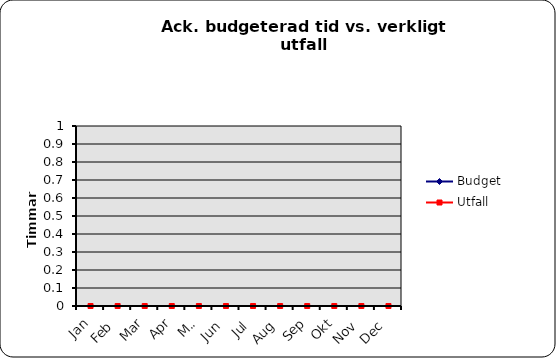
| Category | Budget | Utfall |
|---|---|---|
| Jan | 0 | 0 |
| Feb | 0 | 0 |
| Mar | 0 | 0 |
| Apr | 0 | 0 |
| Maj | 0 | 0 |
| Jun | 0 | 0 |
| Jul | 0 | 0 |
| Aug | 0 | 0 |
| Sep | 0 | 0 |
| Okt | 0 | 0 |
| Nov | 0 | 0 |
| Dec | 0 | 0 |